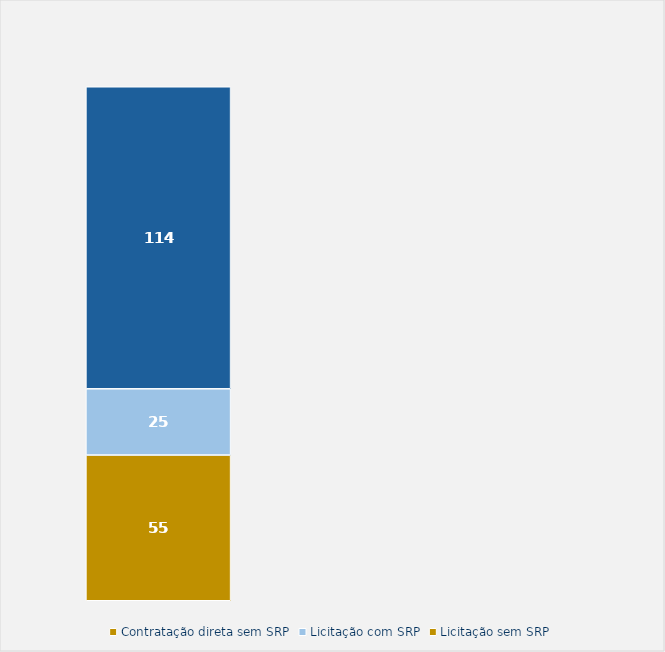
| Category | Contratação direta sem SRP | Licitação com SRP | Licitação sem SRP |
|---|---|---|---|
| Total | 55 | 25 | 114 |